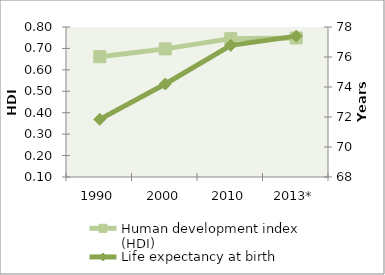
| Category | Human development index (HDI) |
|---|---|
| 1990 | 0.661 |
| 2000 | 0.698 |
| 2010 | 0.746 |
| 2013* | 0.749 |